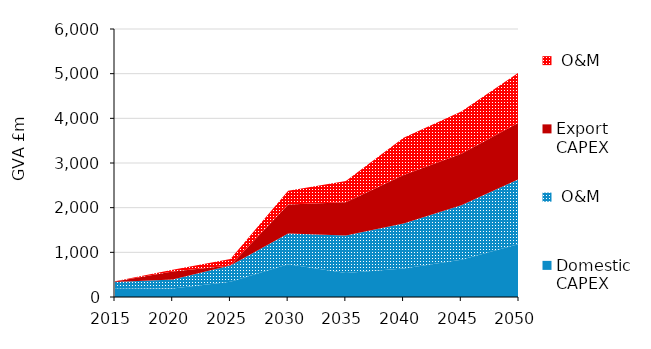
| Category | Domestic | Export |
|---|---|---|
| 2015.0 | 140.249 | 2.188 |
| 2020.0 | 202.522 | 41.698 |
| 2025.0 | 367.258 | 145.27 |
| 2030.0 | 689.561 | 306.823 |
| 2035.0 | 835.575 | 473.172 |
| 2040.0 | 1008.772 | 836.331 |
| 2045.0 | 1219.763 | 944.098 |
| 2050.0 | 1452.396 | 1119.609 |